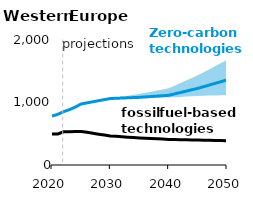
| Category | EUR ZCT Ref | EUR FOS Ref |
|---|---|---|
| 2020.0 | 782.196 | 494.268 |
| 2021.0 | 811.742 | 496.494 |
| 2022.0 | 853.765 | 530.621 |
| 2023.0 | 886.757 | 533.16 |
| 2024.0 | 927.191 | 535.901 |
| 2025.0 | 976.841 | 537.078 |
| 2026.0 | 994.216 | 522.51 |
| 2027.0 | 1011.59 | 507.941 |
| 2028.0 | 1028.965 | 493.372 |
| 2029.0 | 1046.34 | 478.804 |
| 2030.0 | 1063.714 | 464.235 |
| 2031.0 | 1067.453 | 458.097 |
| 2032.0 | 1071.191 | 451.958 |
| 2033.0 | 1074.93 | 445.82 |
| 2034.0 | 1078.668 | 439.681 |
| 2035.0 | 1082.407 | 433.543 |
| 2036.0 | 1088.957 | 428.808 |
| 2037.0 | 1095.508 | 424.074 |
| 2038.0 | 1102.058 | 419.34 |
| 2039.0 | 1108.608 | 414.605 |
| 2040.0 | 1115.158 | 409.871 |
| 2041.0 | 1137.455 | 407.605 |
| 2042.0 | 1159.752 | 405.339 |
| 2043.0 | 1182.049 | 403.073 |
| 2044.0 | 1204.346 | 400.807 |
| 2045.0 | 1226.643 | 398.541 |
| 2046.0 | 1253.551 | 396.697 |
| 2047.0 | 1280.459 | 394.854 |
| 2048.0 | 1307.367 | 393.01 |
| 2049.0 | 1334.275 | 391.167 |
| 2050.0 | 1361.183 | 389.324 |